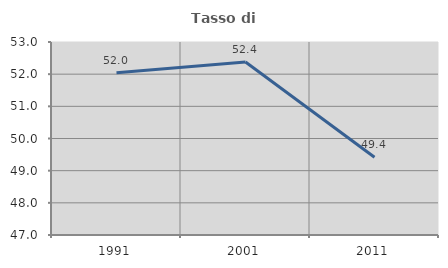
| Category | Tasso di occupazione   |
|---|---|
| 1991.0 | 52.048 |
| 2001.0 | 52.378 |
| 2011.0 | 49.417 |